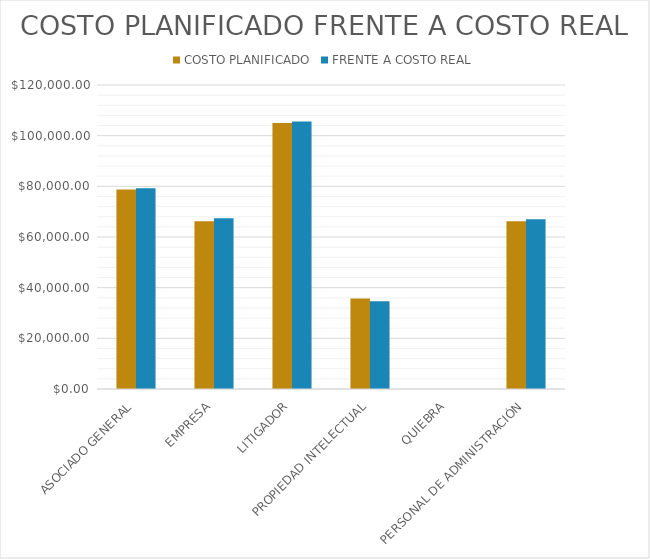
| Category | COSTO PLANIFICADO | FRENTE A COSTO REAL |
|---|---|---|
| ASOCIADO GENERAL | 78750 | 79275 |
| EMPRESA | 66250 | 67375 |
| LITIGADOR | 105000 | 105600 |
| PROPIEDAD INTELECTUAL | 35750 | 34650 |
| QUIEBRA | 0 | 0 |
| PERSONAL DE ADMINISTRACIÓN | 66250 | 67000 |